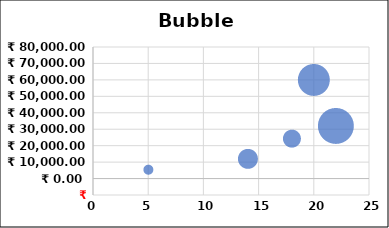
| Category | Sales |
|---|---|
| 5.0 | 5500 |
| 14.0 | 12200 |
| 20.0 | 60000 |
| 18.0 | 24400 |
| 22.0 | 32000 |